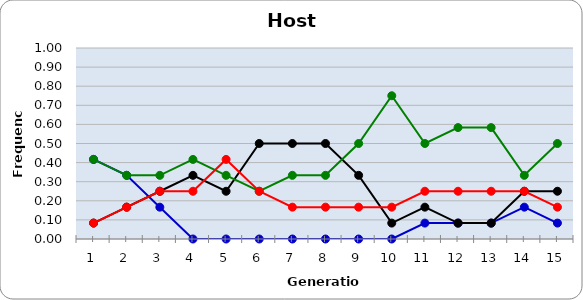
| Category | Sp | Cl | Di | He |
|---|---|---|---|---|
| 1.0 | 0.417 | 0.083 | 0.417 | 0.083 |
| 2.0 | 0.333 | 0.167 | 0.333 | 0.167 |
| 3.0 | 0.167 | 0.25 | 0.333 | 0.25 |
| 4.0 | 0 | 0.333 | 0.417 | 0.25 |
| 5.0 | 0 | 0.25 | 0.333 | 0.417 |
| 6.0 | 0 | 0.5 | 0.25 | 0.25 |
| 7.0 | 0 | 0.5 | 0.333 | 0.167 |
| 8.0 | 0 | 0.5 | 0.333 | 0.167 |
| 9.0 | 0 | 0.333 | 0.5 | 0.167 |
| 10.0 | 0 | 0.083 | 0.75 | 0.167 |
| 11.0 | 0.083 | 0.167 | 0.5 | 0.25 |
| 12.0 | 0.083 | 0.083 | 0.583 | 0.25 |
| 13.0 | 0.083 | 0.083 | 0.583 | 0.25 |
| 14.0 | 0.167 | 0.25 | 0.333 | 0.25 |
| 15.0 | 0.083 | 0.25 | 0.5 | 0.167 |